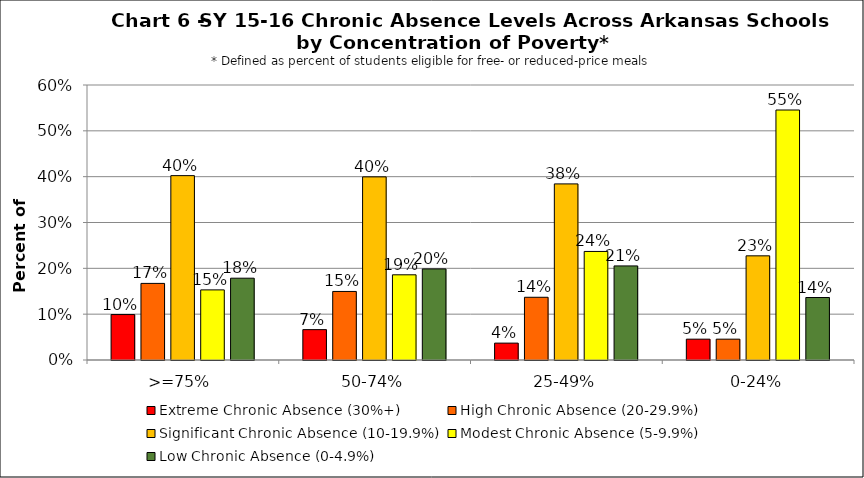
| Category | Extreme Chronic Absence (30%+) | High Chronic Absence (20-29.9%) | Significant Chronic Absence (10-19.9%) | Modest Chronic Absence (5-9.9%) | Low Chronic Absence (0-4.9%) |
|---|---|---|---|---|---|
| 0 | 0.099 | 0.167 | 0.402 | 0.153 | 0.178 |
| 1 | 0.066 | 0.15 | 0.4 | 0.186 | 0.199 |
| 2 | 0.037 | 0.137 | 0.384 | 0.237 | 0.205 |
| 3 | 0.045 | 0.045 | 0.227 | 0.545 | 0.136 |